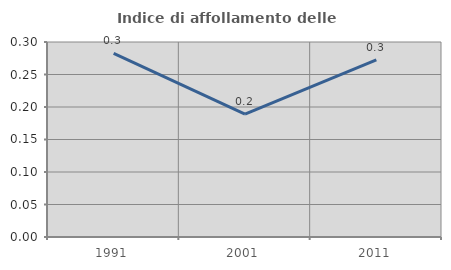
| Category | Indice di affollamento delle abitazioni  |
|---|---|
| 1991.0 | 0.282 |
| 2001.0 | 0.189 |
| 2011.0 | 0.272 |